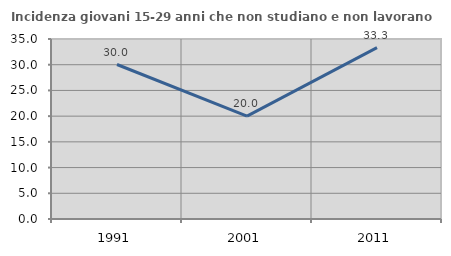
| Category | Incidenza giovani 15-29 anni che non studiano e non lavorano  |
|---|---|
| 1991.0 | 30.038 |
| 2001.0 | 20 |
| 2011.0 | 33.333 |